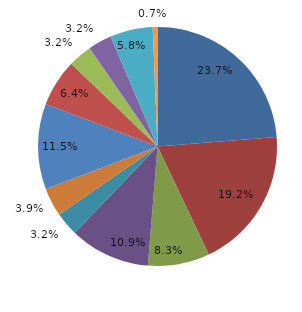
| Category | Series 0 |
|---|---|
| قبل الدخول | 23.718 |
| -1 | 19.231 |
| 1 | 8.333 |
| 2 | 10.897 |
| 3 | 3.205 |
| 4 | 3.846 |
|  5 - 9 | 11.538 |
|  10 - 14 | 6.41 |
|  15 - 19 | 3.205 |
|  20 - 24 | 3.205 |
| 25 + | 5.769 |
| غير مبين | 0.641 |